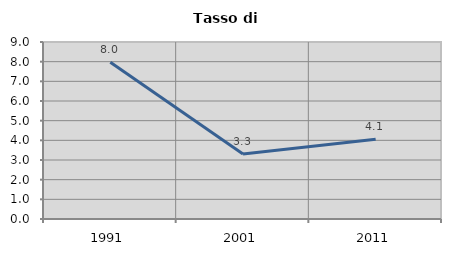
| Category | Tasso di disoccupazione   |
|---|---|
| 1991.0 | 7.968 |
| 2001.0 | 3.302 |
| 2011.0 | 4.054 |